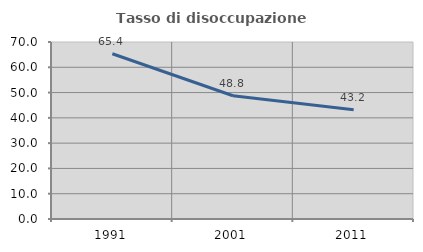
| Category | Tasso di disoccupazione giovanile  |
|---|---|
| 1991.0 | 65.367 |
| 2001.0 | 48.756 |
| 2011.0 | 43.226 |